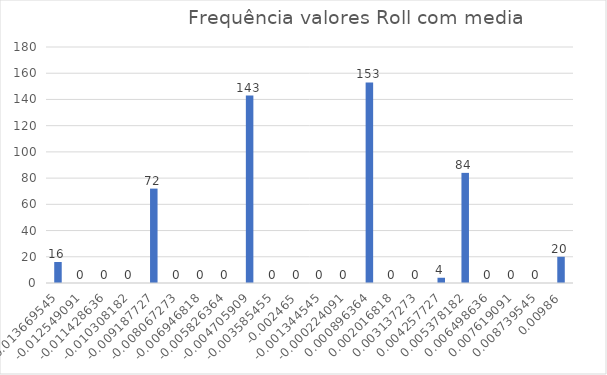
| Category | Series 0 |
|---|---|
| -0.013669545454545453 | 16 |
| -0.012549090909090909 | 0 |
| -0.011428636363636363 | 0 |
| -0.010308181818181817 | 0 |
| -0.009187727272727273 | 72 |
| -0.008067272727272727 | 0 |
| -0.0069468181818181825 | 0 |
| -0.0058263636363636365 | 0 |
| -0.0047059090909090905 | 143 |
| -0.003585454545454546 | 0 |
| -0.002465 | 0 |
| -0.0013445454545454542 | 0 |
| -0.0002240909090909099 | 0 |
| 0.0008963636363636344 | 153 |
| 0.0020168181818181804 | 0 |
| 0.0031372727272727264 | 0 |
| 0.004257727272727272 | 4 |
| 0.005378181818181818 | 84 |
| 0.006498636363636361 | 0 |
| 0.007619090909090907 | 0 |
| 0.008739545454545453 | 0 |
| 0.009859999999999999 | 20 |